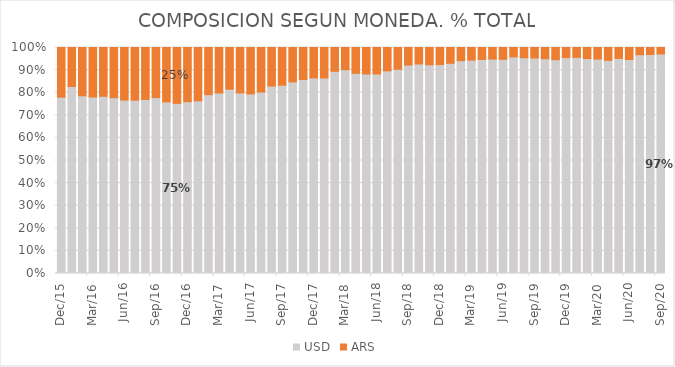
| Category | USD | ARS |
|---|---|---|
| Dec-15 | 0.78 | 0.22 |
| Jan-16 | 0.827 | 0.173 |
| Feb-16 | 0.786 | 0.214 |
| Mar-16 | 0.781 | 0.219 |
| Apr-16 | 0.784 | 0.216 |
| May-16 | 0.778 | 0.222 |
| Jun-16 | 0.768 | 0.232 |
| Jul-16 | 0.767 | 0.233 |
| Aug-16 | 0.77 | 0.23 |
| Sep-16 | 0.779 | 0.221 |
| Oct-16 | 0.759 | 0.241 |
| Nov-16 | 0.753 | 0.247 |
| Dec-16 | 0.76 | 0.24 |
| Jan-17 | 0.764 | 0.236 |
| Feb-17 | 0.791 | 0.209 |
| Mar-17 | 0.799 | 0.201 |
| Apr-17 | 0.816 | 0.184 |
| May-17 | 0.799 | 0.201 |
| Jun-17 | 0.795 | 0.205 |
| Jul-17 | 0.803 | 0.197 |
| Aug-17 | 0.829 | 0.171 |
| Sep-17 | 0.833 | 0.167 |
| Oct-17 | 0.848 | 0.152 |
| Nov-17 | 0.858 | 0.142 |
| Dec-17 | 0.865 | 0.135 |
| Jan-18 | 0.865 | 0.135 |
| Feb-18 | 0.895 | 0.105 |
| Mar-18 | 0.902 | 0.098 |
| Apr-18 | 0.885 | 0.115 |
| May-18 | 0.883 | 0.117 |
| Jun-18 | 0.883 | 0.117 |
| Jul-18 | 0.897 | 0.103 |
| Aug-18 | 0.904 | 0.096 |
| Sep-18 | 0.922 | 0.078 |
| Oct-18 | 0.927 | 0.073 |
| Nov-18 | 0.924 | 0.076 |
| Dec-18 | 0.925 | 0.075 |
| Jan-19 | 0.93 | 0.07 |
| Feb-19 | 0.942 | 0.058 |
| Mar-19 | 0.944 | 0.056 |
| Apr-19 | 0.947 | 0.053 |
| May-19 | 0.949 | 0.051 |
| Jun-19 | 0.948 | 0.052 |
| Jul-19 | 0.958 | 0.042 |
| Aug-19 | 0.955 | 0.045 |
| Sep-19 | 0.954 | 0.046 |
| Oct-19 | 0.95 | 0.05 |
| Nov-19 | 0.946 | 0.054 |
| Dec-19 | 0.955 | 0.045 |
| Jan-20 | 0.956 | 0.044 |
| Feb-20 | 0.951 | 0.049 |
| Mar-20 | 0.949 | 0.051 |
| Apr-20 | 0.943 | 0.057 |
| May-20 | 0.952 | 0.048 |
| Jun-20 | 0.947 | 0.053 |
| Jul-20 | 0.968 | 0.032 |
| Aug-20 | 0.969 | 0.031 |
| Sep-20 | 0.971 | 0.029 |